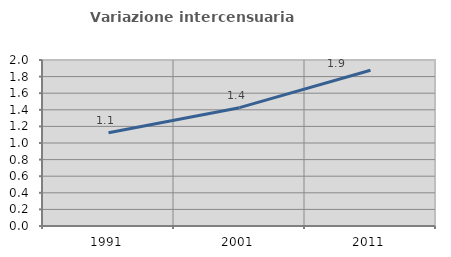
| Category | Variazione intercensuaria annua |
|---|---|
| 1991.0 | 1.123 |
| 2001.0 | 1.426 |
| 2011.0 | 1.876 |